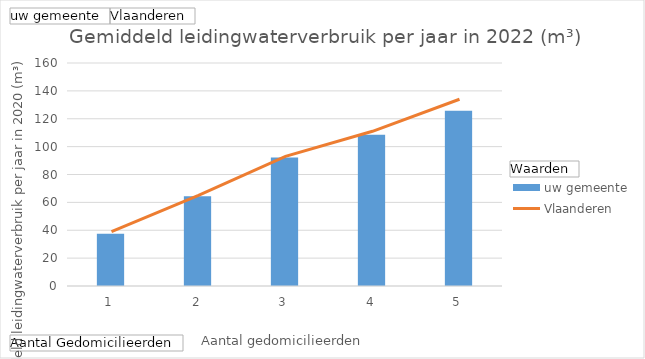
| Category | uw gemeente |
|---|---|
| 1 | 37.439 |
| 2 | 64.443 |
| 3 | 92.229 |
| 4 | 108.53 |
| 5 | 125.734 |